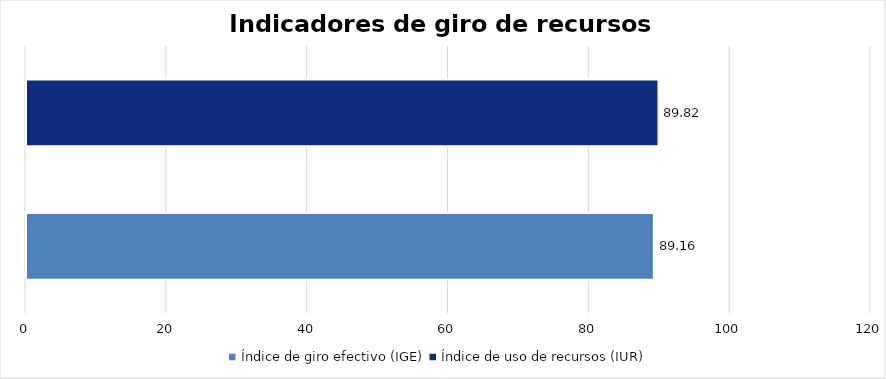
| Category | Series 0 |
|---|---|
| Índice de giro efectivo (IGE) | 89.162 |
| Índice de uso de recursos (IUR)  | 89.822 |